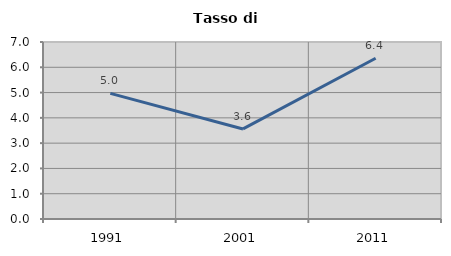
| Category | Tasso di disoccupazione   |
|---|---|
| 1991.0 | 4.968 |
| 2001.0 | 3.562 |
| 2011.0 | 6.358 |